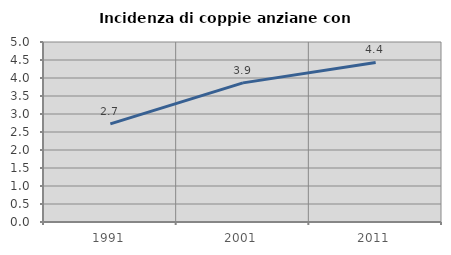
| Category | Incidenza di coppie anziane con figli |
|---|---|
| 1991.0 | 2.725 |
| 2001.0 | 3.864 |
| 2011.0 | 4.431 |